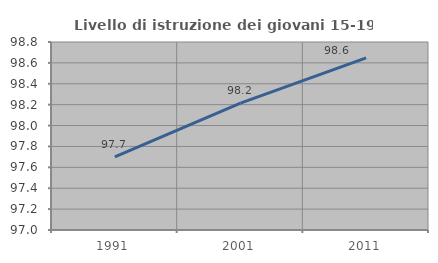
| Category | Livello di istruzione dei giovani 15-19 anni |
|---|---|
| 1991.0 | 97.701 |
| 2001.0 | 98.214 |
| 2011.0 | 98.649 |